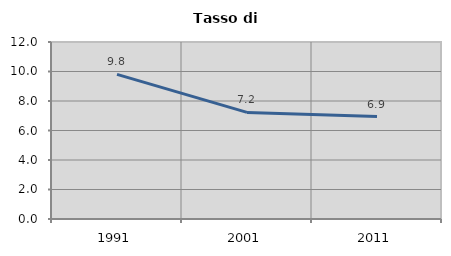
| Category | Tasso di disoccupazione   |
|---|---|
| 1991.0 | 9.808 |
| 2001.0 | 7.227 |
| 2011.0 | 6.946 |